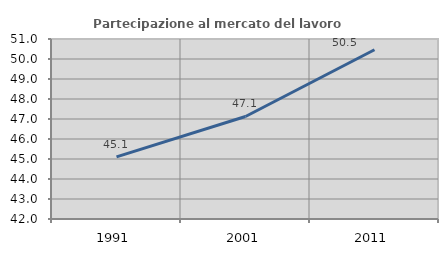
| Category | Partecipazione al mercato del lavoro  femminile |
|---|---|
| 1991.0 | 45.109 |
| 2001.0 | 47.126 |
| 2011.0 | 50.462 |